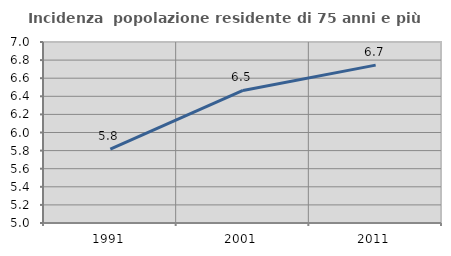
| Category | Incidenza  popolazione residente di 75 anni e più |
|---|---|
| 1991.0 | 5.817 |
| 2001.0 | 6.465 |
| 2011.0 | 6.744 |